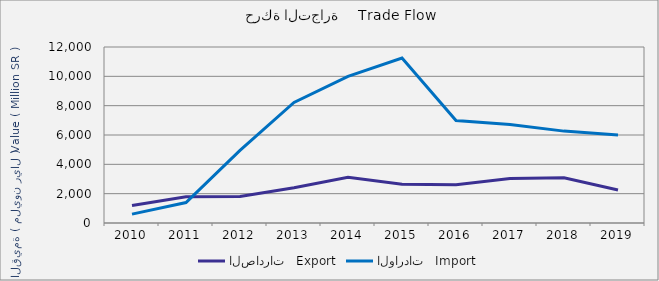
| Category | الصادرات   Export | الواردات   Import |
|---|---|---|
| 2010.0 | 1197208048 | 607322872 |
| 2011.0 | 1796453789 | 1391921185 |
| 2012.0 | 1803195987 | 4952975328 |
| 2013.0 | 2406576421 | 8216343098 |
| 2014.0 | 3115123290 | 9997624106 |
| 2015.0 | 2635999903 | 11249555460 |
| 2016.0 | 2604767068 | 6981829012 |
| 2017.0 | 3025950574 | 6710351659 |
| 2018.0 | 3077444357 | 6264513685 |
| 2019.0 | 2246526944 | 6003050141 |